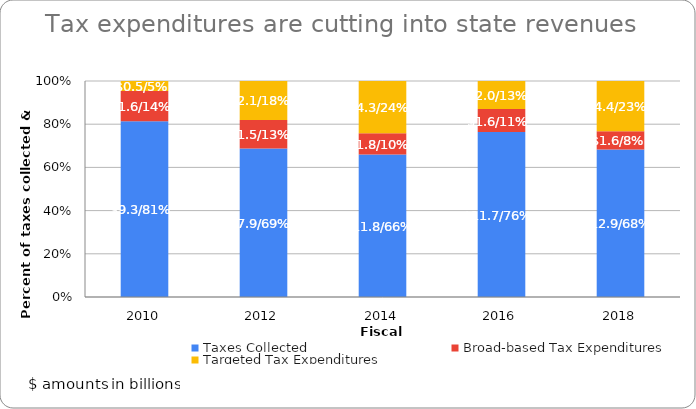
| Category | Taxes Collected | Broad-based Tax Expenditures | Targeted Tax Expenditures |
|---|---|---|---|
| 2010.0 | 9.28 | 1.598 | 0.523 |
| 2012.0 | 7.937 | 1.533 | 2.079 |
| 2014.0 | 11.766 | 1.753 | 4.311 |
| 2016.0 | 11.671 | 1.639 | 1.977 |
| 2018.0 | 12.891 | 1.584 | 4.4 |